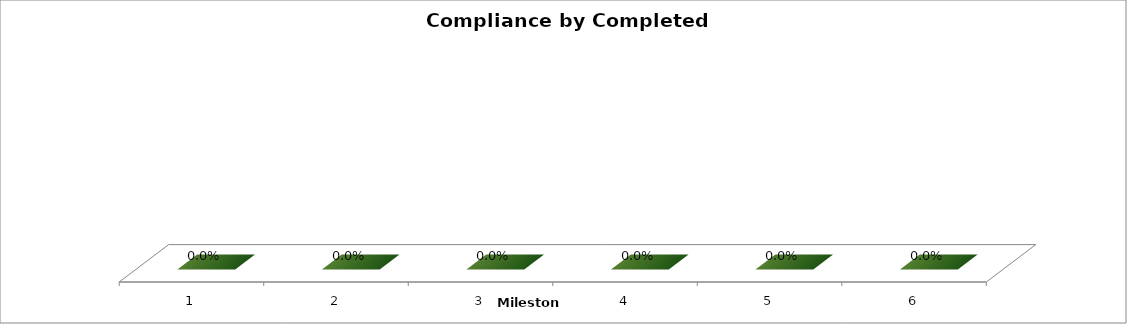
| Category | Compliance by Milestones |
|---|---|
| 0 | 0 |
| 1 | 0 |
| 2 | 0 |
| 3 | 0 |
| 4 | 0 |
| 5 | 0 |